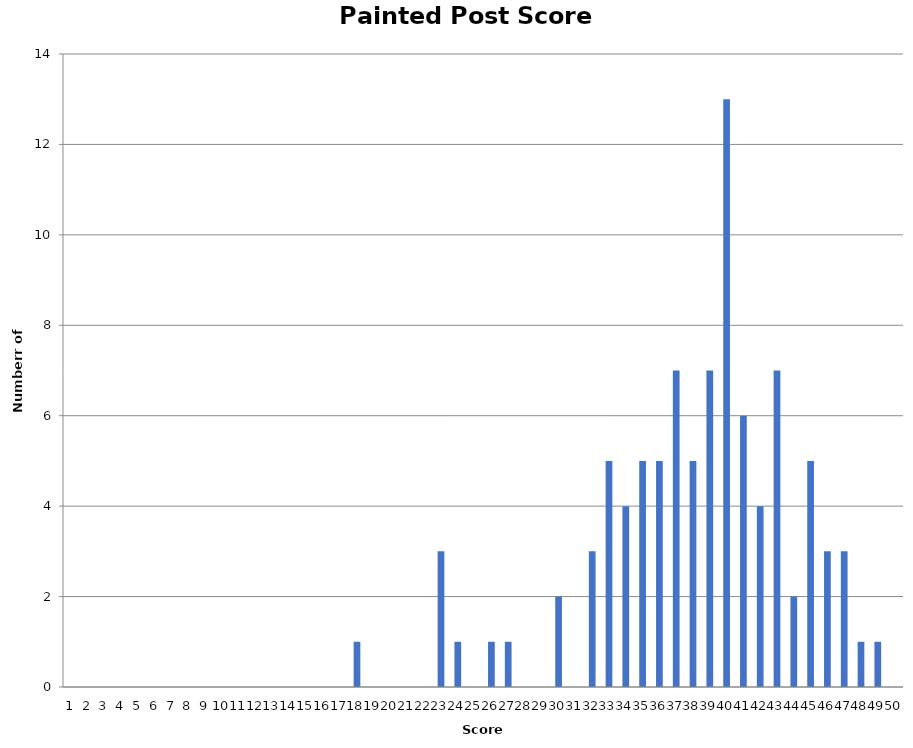
| Category | PP |
|---|---|
| 0 | 0 |
| 1 | 0 |
| 2 | 0 |
| 3 | 0 |
| 4 | 0 |
| 5 | 0 |
| 6 | 0 |
| 7 | 0 |
| 8 | 0 |
| 9 | 0 |
| 10 | 0 |
| 11 | 0 |
| 12 | 0 |
| 13 | 0 |
| 14 | 0 |
| 15 | 0 |
| 16 | 0 |
| 17 | 1 |
| 18 | 0 |
| 19 | 0 |
| 20 | 0 |
| 21 | 0 |
| 22 | 3 |
| 23 | 1 |
| 24 | 0 |
| 25 | 1 |
| 26 | 1 |
| 27 | 0 |
| 28 | 0 |
| 29 | 2 |
| 30 | 0 |
| 31 | 3 |
| 32 | 5 |
| 33 | 4 |
| 34 | 5 |
| 35 | 5 |
| 36 | 7 |
| 37 | 5 |
| 38 | 7 |
| 39 | 13 |
| 40 | 6 |
| 41 | 4 |
| 42 | 7 |
| 43 | 2 |
| 44 | 5 |
| 45 | 3 |
| 46 | 3 |
| 47 | 1 |
| 48 | 1 |
| 49 | 0 |